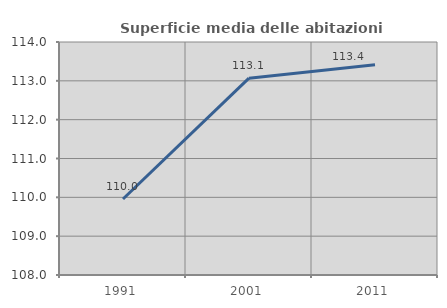
| Category | Superficie media delle abitazioni occupate |
|---|---|
| 1991.0 | 109.958 |
| 2001.0 | 113.069 |
| 2011.0 | 113.415 |